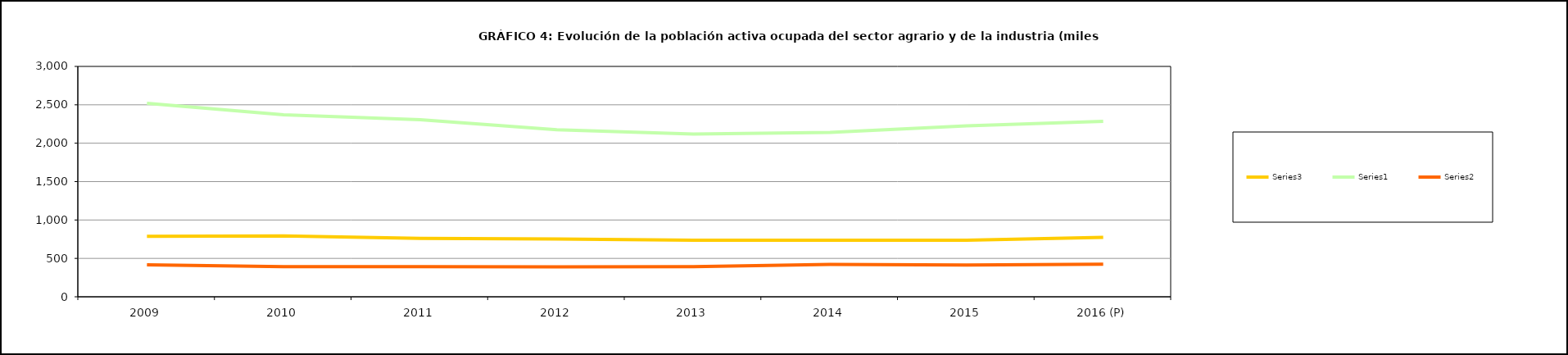
| Category | Series 3 | Series 0 | Series 1 |
|---|---|---|---|
| 2009 | 786.05 | 2519.475 | 415.6 |
| 2010 | 792.975 | 2370.1 | 392.275 |
| 2011 | 760.15 | 2304.9 | 393.05 |
| 2012 | 753.225 | 2175.575 | 388.925 |
| 2013 | 736.6 | 2118.7 | 393.3 |
| 2014 | 735.85 | 2141.4 | 420.65 |
| 2015 | 736.75 | 2225.025 | 414.025 |
| 2016 (P) | 774.5 | 2284.2 | 423.7 |